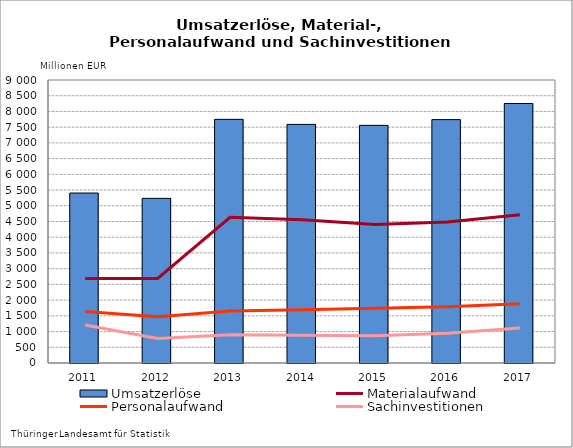
| Category | Umsatzerlöse |
|---|---|
| 2011.0 | 5405 |
| 2012.0 | 5236 |
| 2013.0 | 7748.836 |
| 2014.0 | 7588.59 |
| 2015.0 | 7557.268 |
| 2016.0 | 7740.227 |
| 2017.0 | 8252.208 |